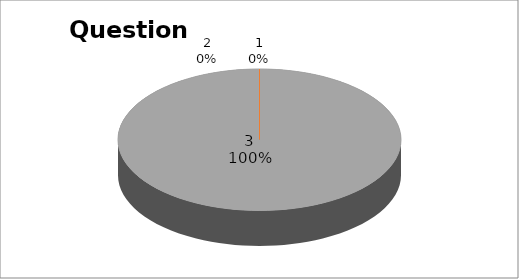
| Category | Series 0 |
|---|---|
| 0 | 0 |
| 1 | 0 |
| 2 | 21 |